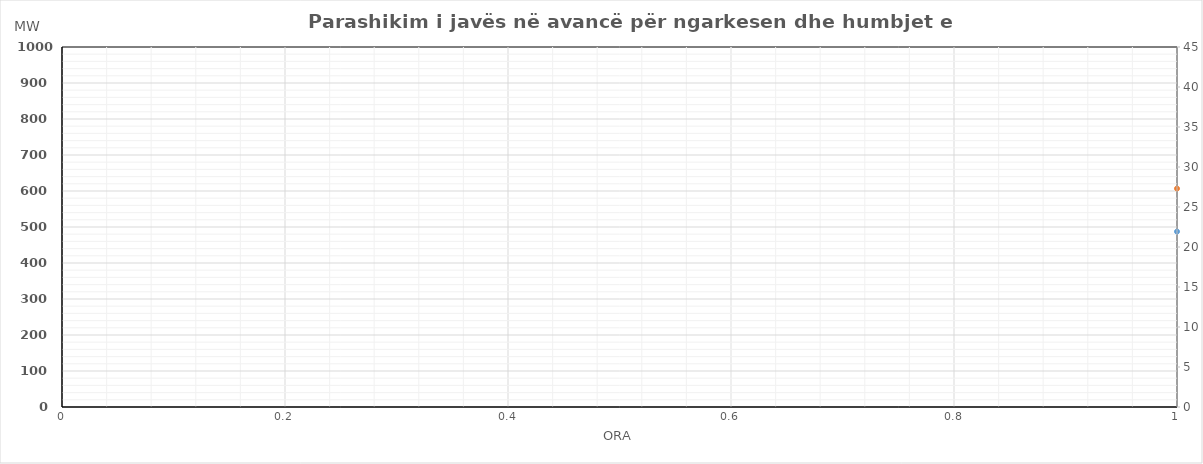
| Category | Ngarkesa (MWh) |
|---|---|
| 0 | 606.71 |
| 1 | 552.04 |
| 2 | 527.51 |
| 3 | 524 |
| 4 | 523.61 |
| 5 | 563.33 |
| 6 | 670.63 |
| 7 | 801.12 |
| 8 | 843.86 |
| 9 | 838.49 |
| 10 | 825.3 |
| 11 | 817.21 |
| 12 | 810.23 |
| 13 | 827.88 |
| 14 | 830.99 |
| 15 | 824.37 |
| 16 | 808.67 |
| 17 | 824.48 |
| 18 | 802.07 |
| 19 | 830.59 |
| 20 | 883.85 |
| 21 | 867.23 |
| 22 | 811.11 |
| 23 | 706.71 |
| 24 | 600.85 |
| 25 | 554.94 |
| 26 | 536.54 |
| 27 | 529.52 |
| 28 | 537.94 |
| 29 | 577.84 |
| 30 | 679.66 |
| 31 | 812.33 |
| 32 | 853.48 |
| 33 | 834.33 |
| 34 | 818.44 |
| 35 | 815.82 |
| 36 | 829.73 |
| 37 | 830.02 |
| 38 | 813.79 |
| 39 | 812.72 |
| 40 | 796.29 |
| 41 | 810.73 |
| 42 | 802.63 |
| 43 | 827.45 |
| 44 | 903.51 |
| 45 | 883.05 |
| 46 | 810.07 |
| 47 | 694.47 |
| 48 | 594.73 |
| 49 | 545.45 |
| 50 | 522.93 |
| 51 | 518.06 |
| 52 | 526.45 |
| 53 | 565.12 |
| 54 | 669.37 |
| 55 | 806.17 |
| 56 | 848.22 |
| 57 | 830.5 |
| 58 | 812.49 |
| 59 | 803.54 |
| 60 | 852.38 |
| 61 | 868.23 |
| 62 | 823.73 |
| 63 | 813.75 |
| 64 | 805.69 |
| 65 | 825.54 |
| 66 | 853.46 |
| 67 | 888.82 |
| 68 | 950.61 |
| 69 | 926.04 |
| 70 | 854.01 |
| 71 | 737.81 |
| 72 | 611.56 |
| 73 | 562.28 |
| 74 | 548.56 |
| 75 | 540.86 |
| 76 | 547.97 |
| 77 | 588.74 |
| 78 | 691.15 |
| 79 | 823.09 |
| 80 | 868.29 |
| 81 | 876.23 |
| 82 | 860.02 |
| 83 | 872.69 |
| 84 | 832.09 |
| 85 | 837.28 |
| 86 | 839.96 |
| 87 | 813.27 |
| 88 | 828.83 |
| 89 | 844.72 |
| 90 | 826.97 |
| 91 | 858.58 |
| 92 | 915.22 |
| 93 | 899.47 |
| 94 | 841.77 |
| 95 | 723.47 |
| 96 | 611.35 |
| 97 | 564.34 |
| 98 | 541.81 |
| 99 | 534.96 |
| 100 | 542.2 |
| 101 | 578.25 |
| 102 | 673.8 |
| 103 | 801.29 |
| 104 | 846.91 |
| 105 | 844.49 |
| 106 | 837.48 |
| 107 | 846.69 |
| 108 | 835.8 |
| 109 | 828.5 |
| 110 | 802.71 |
| 111 | 796.98 |
| 112 | 799.56 |
| 113 | 814.44 |
| 114 | 804.95 |
| 115 | 830.66 |
| 116 | 888.21 |
| 117 | 876.22 |
| 118 | 815.07 |
| 119 | 703.1 |
| 120 | 606.18 |
| 121 | 560.44 |
| 122 | 536.84 |
| 123 | 527.54 |
| 124 | 535.94 |
| 125 | 572.11 |
| 126 | 654.16 |
| 127 | 758.13 |
| 128 | 833.78 |
| 129 | 874.15 |
| 130 | 863.7 |
| 131 | 858.23 |
| 132 | 859.35 |
| 133 | 866.95 |
| 134 | 840.36 |
| 135 | 810.12 |
| 136 | 808.05 |
| 137 | 843.85 |
| 138 | 873.26 |
| 139 | 880.98 |
| 140 | 928.85 |
| 141 | 898.98 |
| 142 | 798.99 |
| 143 | 682.79 |
| 144 | 592.28 |
| 145 | 550.64 |
| 146 | 529.24 |
| 147 | 519.14 |
| 148 | 525.84 |
| 149 | 547.81 |
| 150 | 620.06 |
| 151 | 695.43 |
| 152 | 757.68 |
| 153 | 788.65 |
| 154 | 799 |
| 155 | 798.33 |
| 156 | 801.65 |
| 157 | 798.75 |
| 158 | 751.96 |
| 159 | 734.62 |
| 160 | 749.35 |
| 161 | 779.35 |
| 162 | 825.66 |
| 163 | 861.58 |
| 164 | 921.45 |
| 165 | 917.88 |
| 166 | 814.49 |
| 167 | 688.99 |